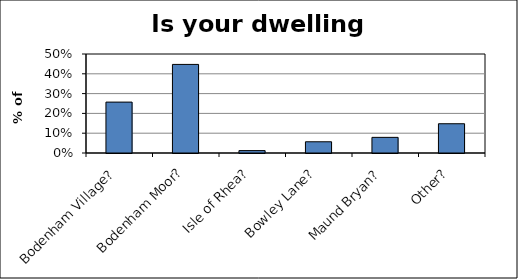
| Category | Series 0 |
|---|---|
| Bodenham Village? | 0.257 |
| Bodenham Moor? | 0.447 |
| Isle of Rhea? | 0.012 |
| Bowley Lane? | 0.057 |
| Maund Bryan? | 0.079 |
| Other? | 0.148 |